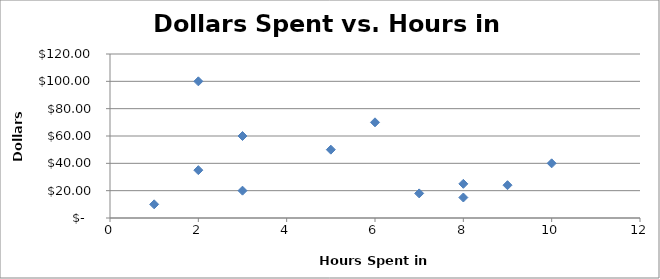
| Category | Dollars spent |
|---|---|
| 10.0 | 40 |
| 8.0 | 15 |
| 9.0 | 24 |
| 3.0 | 20 |
| 1.0 | 10 |
| 2.0 | 35 |
| 5.0 | 50 |
| 6.0 | 70 |
| 7.0 | 18 |
| 8.0 | 25 |
| 2.0 | 100 |
| 3.0 | 60 |